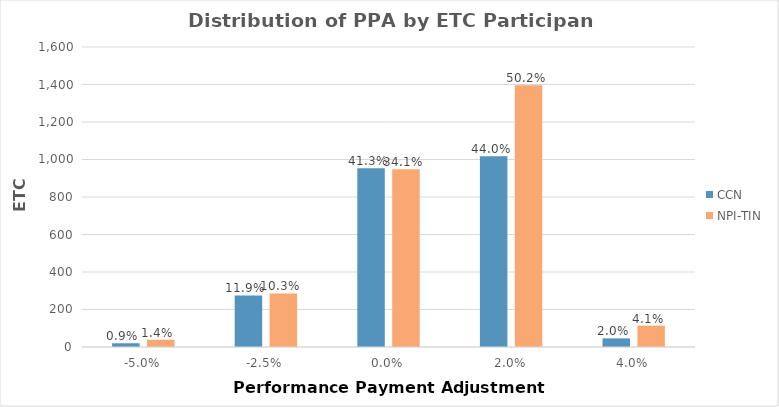
| Category | CCN | NPI-TIN |
|---|---|---|
| -5.0% | 20 | 39 |
| -2.5% | 275 | 286 |
| 0.0% | 954 | 948 |
| 2.0% | 1017 | 1396 |
| 4.0% | 46 | 114 |